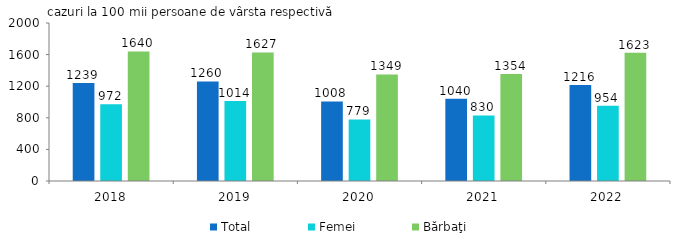
| Category | Total | Femei | Bărbaţi |
|---|---|---|---|
| 2018.0 | 1239.376 | 972.122 | 1639.552 |
| 2019.0 | 1259.622 | 1013.579 | 1626.903 |
| 2020.0 | 1007.522 | 778.856 | 1349.308 |
| 2021.0 | 1039.895 | 830.348 | 1354.199 |
| 2022.0 | 1216.078 | 954.017 | 1623.028 |